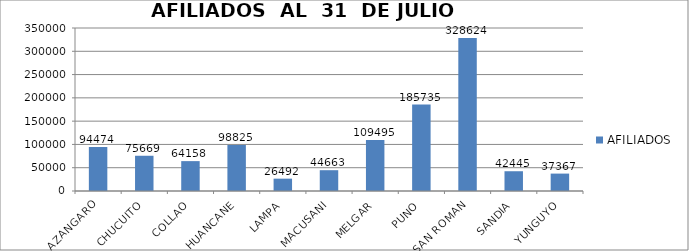
| Category | AFILIADOS |
|---|---|
| AZANGARO | 94474 |
| CHUCUITO | 75669 |
| COLLAO | 64158 |
| HUANCANE | 98825 |
| LAMPA | 26492 |
| MACUSANI | 44663 |
| MELGAR | 109495 |
| PUNO | 185735 |
| SAN ROMAN | 328624 |
| SANDIA | 42445 |
| YUNGUYO | 37367 |